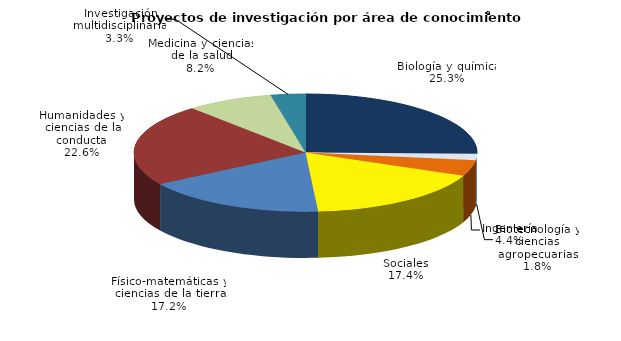
| Category | Series 0 |
|---|---|
| Biología y química | 0.253 |
| Biotecnología y ciencias agropecuarias | 0.018 |
| Ingeniería | 0.044 |
| Sociales | 0.174 |
| Físico-matemáticas y ciencias de la tierra | 0.172 |
| Humanidades y ciencias de la conducta | 0.226 |
| Medicina y ciencias de la salud | 0.082 |
| Investigación multidisciplinaria | 0.033 |